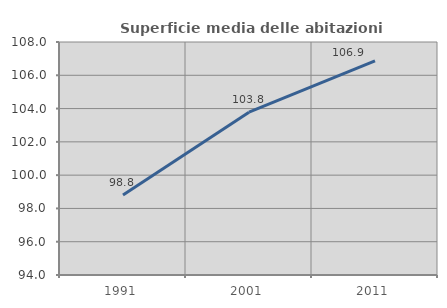
| Category | Superficie media delle abitazioni occupate |
|---|---|
| 1991.0 | 98.806 |
| 2001.0 | 103.785 |
| 2011.0 | 106.869 |